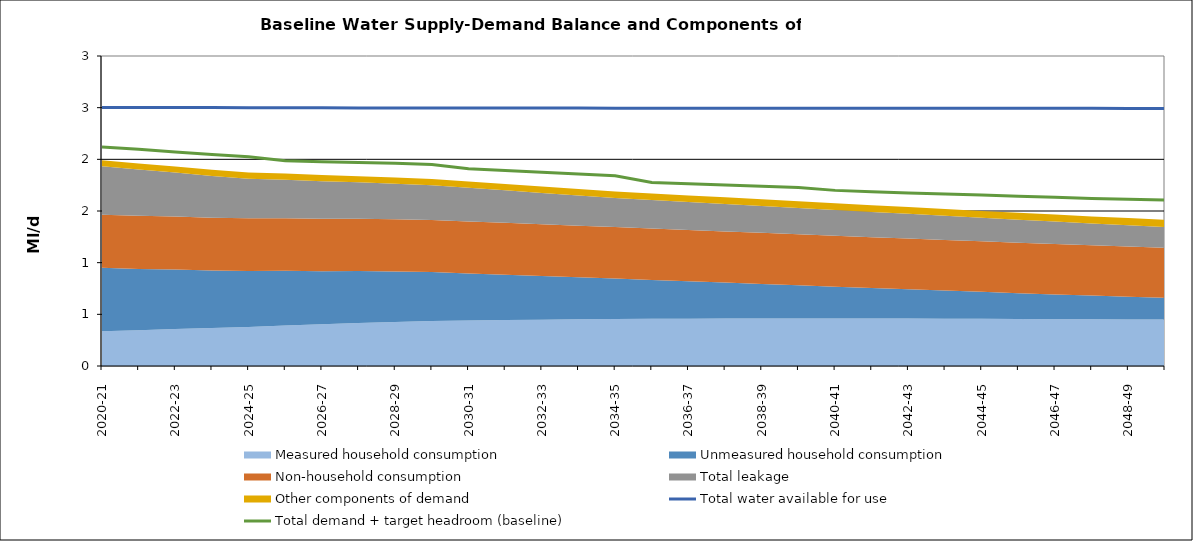
| Category | Total water available for use | Total demand + target headroom (baseline) |
|---|---|---|
| 0 | 2.503 | 2.12 |
| 1 | 2.502 | 2.097 |
| 2 | 2.501 | 2.072 |
| 3 | 2.501 | 2.046 |
| 4 | 2.5 | 2.025 |
| 5 | 2.499 | 1.987 |
| 6 | 2.499 | 1.976 |
| 7 | 2.498 | 1.97 |
| 8 | 2.497 | 1.961 |
| 9 | 2.497 | 1.949 |
| 10 | 2.496 | 1.909 |
| 11 | 2.496 | 1.893 |
| 12 | 2.496 | 1.875 |
| 13 | 2.496 | 1.858 |
| 14 | 2.495 | 1.842 |
| 15 | 2.495 | 1.777 |
| 16 | 2.495 | 1.764 |
| 17 | 2.495 | 1.752 |
| 18 | 2.495 | 1.74 |
| 19 | 2.495 | 1.727 |
| 20 | 2.494 | 1.7 |
| 21 | 2.494 | 1.687 |
| 22 | 2.494 | 1.675 |
| 23 | 2.494 | 1.664 |
| 24 | 2.494 | 1.654 |
| 25 | 2.494 | 1.643 |
| 26 | 2.493 | 1.632 |
| 27 | 2.493 | 1.622 |
| 28 | 2.493 | 1.614 |
| 29 | 2.493 | 1.606 |